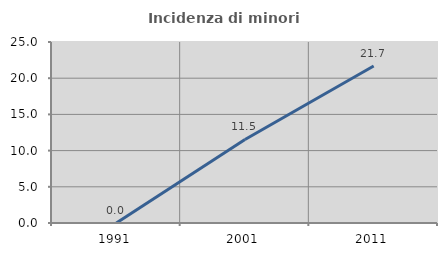
| Category | Incidenza di minori stranieri |
|---|---|
| 1991.0 | 0 |
| 2001.0 | 11.538 |
| 2011.0 | 21.687 |